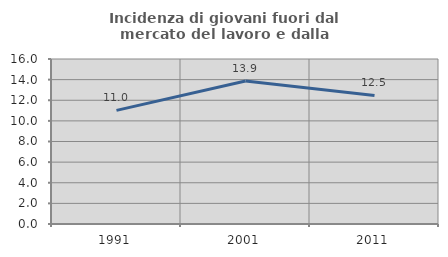
| Category | Incidenza di giovani fuori dal mercato del lavoro e dalla formazione  |
|---|---|
| 1991.0 | 11.021 |
| 2001.0 | 13.864 |
| 2011.0 | 12.463 |